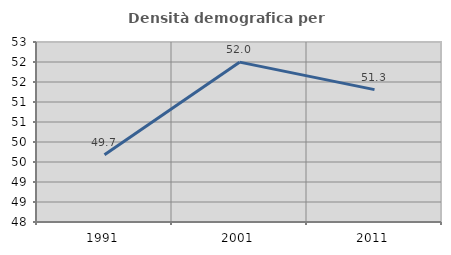
| Category | Densità demografica |
|---|---|
| 1991.0 | 49.68 |
| 2001.0 | 51.996 |
| 2011.0 | 51.31 |